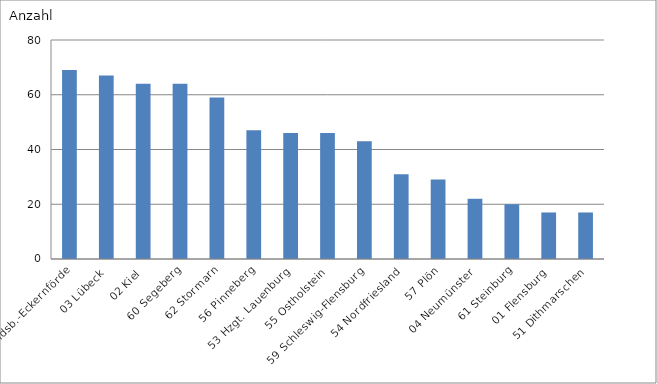
| Category | 58 Rendsb.-Eckernförde |
|---|---|
| 58 Rendsb.-Eckernförde | 69 |
| 03 Lübeck | 67 |
| 02 Kiel | 64 |
| 60 Segeberg | 64 |
| 62 Stormarn | 59 |
| 56 Pinneberg | 47 |
| 53 Hzgt. Lauenburg | 46 |
| 55 Ostholstein | 46 |
| 59 Schleswig-Flensburg | 43 |
| 54 Nordfriesland | 31 |
| 57 Plön | 29 |
| 04 Neumünster | 22 |
| 61 Steinburg | 20 |
| 01 Flensburg | 17 |
| 51 Dithmarschen | 17 |